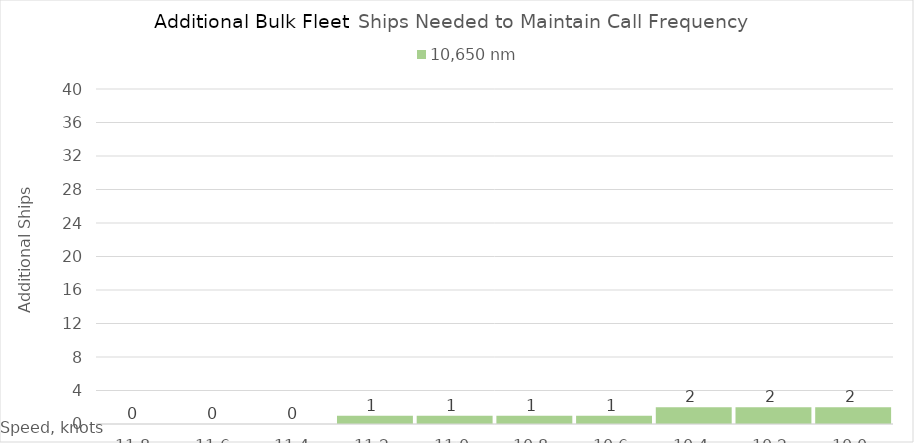
| Category | 10,650 |
|---|---|
| 11.8 | 0 |
| 11.600000000000001 | 0 |
| 11.400000000000002 | 0 |
| 11.200000000000003 | 1 |
| 11.000000000000004 | 1 |
| 10.800000000000004 | 1 |
| 10.600000000000005 | 1 |
| 10.400000000000006 | 2 |
| 10.200000000000006 | 2 |
| 10.000000000000007 | 2 |